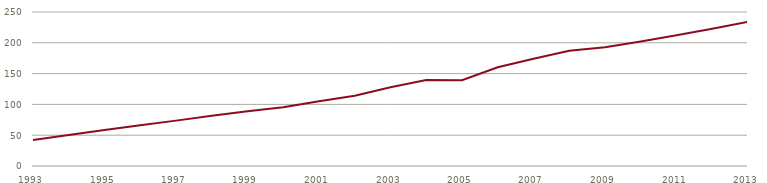
| Category | Antal pr. dansker over 18 år |
|---|---|
| 1993 | 42.046 |
| 1994 | 50.499 |
| 1995 | 58.338 |
| 1996 | 66.339 |
| 1997 | 73.651 |
| 1998 | 81.464 |
| 1999 | 88.756 |
| 2000 | 95.498 |
| 2001 | 104.941 |
| 2002 | 113.887 |
| 2003 | 127.69 |
| 2004 | 139.687 |
| 2005 | 139.344 |
| 2006 | 160.382 |
| 2007 | 174.139 |
| 2008 | 186.933 |
| 2009 | 192.871 |
| 2010 | 201.975 |
| 2011 | 212.082 |
| 2012 | 222.779 |
| 2013 | 233.929 |